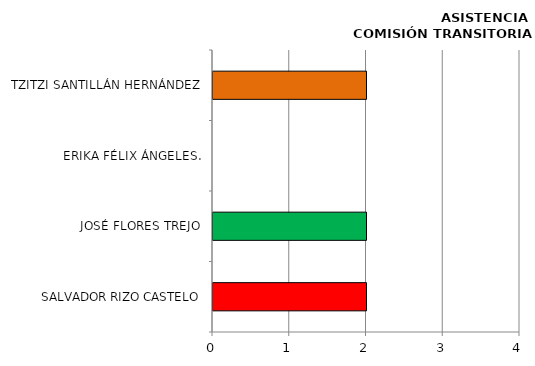
| Category | Series 0 |
|---|---|
| SALVADOR RIZO CASTELO | 2 |
| JOSÉ FLORES TREJO | 2 |
| ERIKA FÉLIX ÁNGELES. | 0 |
| TZITZI SANTILLÁN HERNÁNDEZ | 2 |